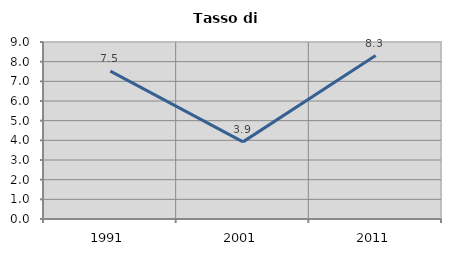
| Category | Tasso di disoccupazione   |
|---|---|
| 1991.0 | 7.516 |
| 2001.0 | 3.922 |
| 2011.0 | 8.308 |